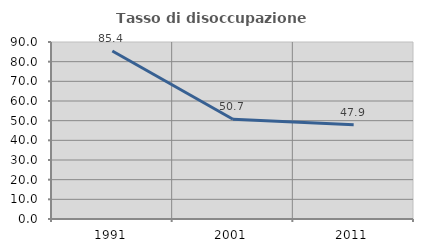
| Category | Tasso di disoccupazione giovanile  |
|---|---|
| 1991.0 | 85.393 |
| 2001.0 | 50.746 |
| 2011.0 | 47.887 |